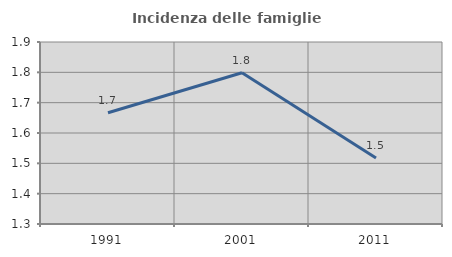
| Category | Incidenza delle famiglie numerose |
|---|---|
| 1991.0 | 1.667 |
| 2001.0 | 1.799 |
| 2011.0 | 1.518 |